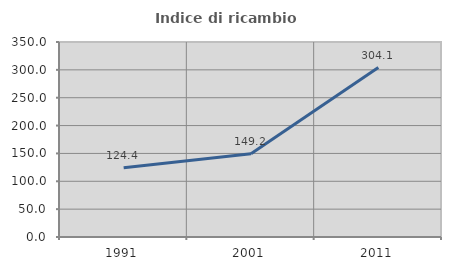
| Category | Indice di ricambio occupazionale  |
|---|---|
| 1991.0 | 124.37 |
| 2001.0 | 149.246 |
| 2011.0 | 304.054 |